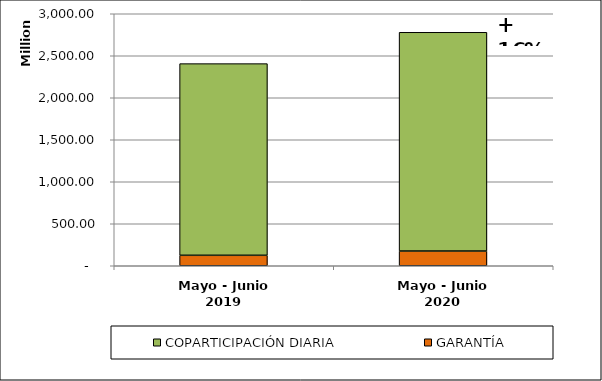
| Category | GARANTÍA | COPARTICIPACIÓN DIARIA |
|---|---|---|
| Mayo - Junio 2019 | 124548216.25 | 2281744711.3 |
| Mayo - Junio 2020 | 175396889.02 | 2604081266.94 |